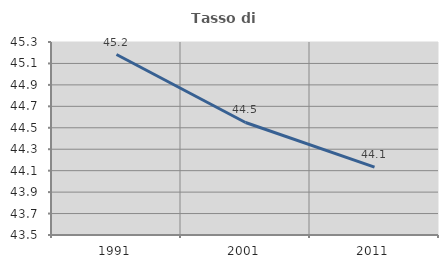
| Category | Tasso di occupazione   |
|---|---|
| 1991.0 | 45.183 |
| 2001.0 | 44.549 |
| 2011.0 | 44.133 |